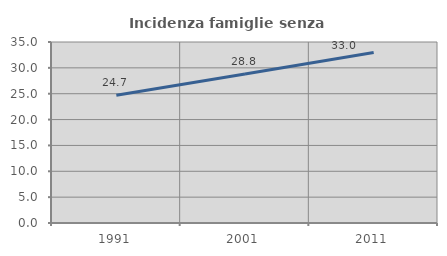
| Category | Incidenza famiglie senza nuclei |
|---|---|
| 1991.0 | 24.716 |
| 2001.0 | 28.796 |
| 2011.0 | 32.984 |